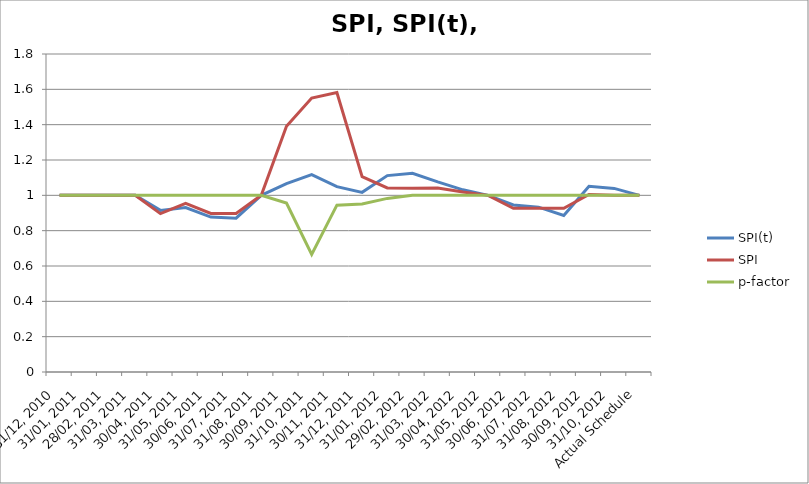
| Category | SPI(t) | SPI | p-factor |
|---|---|---|---|
| 31/12, 2010 | 1 | 1 | 1 |
| 31/01, 2011 | 1 | 1 | 1 |
| 28/02, 2011 | 1 | 1 | 1 |
| 31/03, 2011 | 1 | 1 | 1 |
| 30/04, 2011 | 0.915 | 0.896 | 1 |
| 31/05, 2011 | 0.931 | 0.954 | 1 |
| 30/06, 2011 | 0.877 | 0.897 | 1 |
| 31/07, 2011 | 0.871 | 0.897 | 1 |
| 31/08, 2011 | 1 | 1 | 1 |
| 30/09, 2011 | 1.066 | 1.391 | 0.956 |
| 31/10, 2011 | 1.118 | 1.551 | 0.666 |
| 30/11, 2011 | 1.049 | 1.582 | 0.944 |
| 31/12, 2011 | 1.017 | 1.106 | 0.952 |
| 31/01, 2012 | 1.112 | 1.042 | 0.983 |
| 29/02, 2012 | 1.125 | 1.041 | 1 |
| 31/03, 2012 | 1.076 | 1.042 | 1 |
| 30/04, 2012 | 1.031 | 1.019 | 1 |
| 31/05, 2012 | 1 | 1 | 1 |
| 30/06, 2012 | 0.946 | 0.927 | 1 |
| 31/07, 2012 | 0.933 | 0.927 | 1 |
| 31/08, 2012 | 0.886 | 0.927 | 1 |
| 30/09, 2012 | 1.051 | 1.005 | 1 |
| 31/10, 2012 | 1.039 | 1 | 1 |
| Actual Schedule | 1 | 1 | 1 |